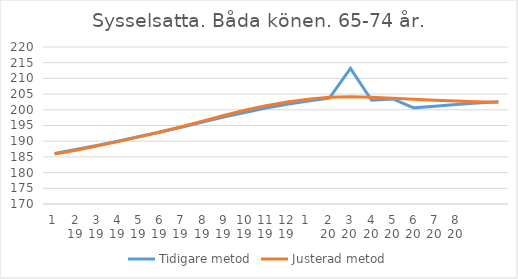
| Category | Tidigare metod | Justerad metod |
|---|---|---|
| 0 | 186.11 | 185.95 |
| 1 | 187.34 | 187.15 |
| 2 | 188.64 | 188.46 |
| 3 | 190.03 | 189.87 |
| 4 | 191.47 | 191.37 |
| 5 | 192.93 | 192.93 |
| 6 | 194.46 | 194.59 |
| 7 | 196.07 | 196.38 |
| 8 | 197.66 | 198.17 |
| 9 | 199.16 | 199.84 |
| 10 | 200.55 | 201.32 |
| 11 | 201.76 | 202.51 |
| 12 | 202.81 | 203.38 |
| 13 | 203.73 | 203.98 |
| 14 | 213.2 | 204.15 |
| 15 | 203.05 | 203.97 |
| 16 | 203.45 | 203.67 |
| 17 | 200.62 | 203.37 |
| 18 | 201.13 | 203.07 |
| 19 | 201.66 | 202.82 |
| 20 | 202.15 | 202.6 |
| 21 | 202.59 | 202.41 |